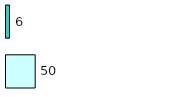
| Category | Series 0 | Series 1 |
|---|---|---|
| 0 | 50 | 6 |